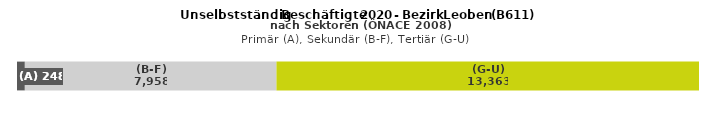
| Category | (A) | (B-F) | (G-U) |
|---|---|---|---|
| 0 | 248 | 7958 | 13363 |